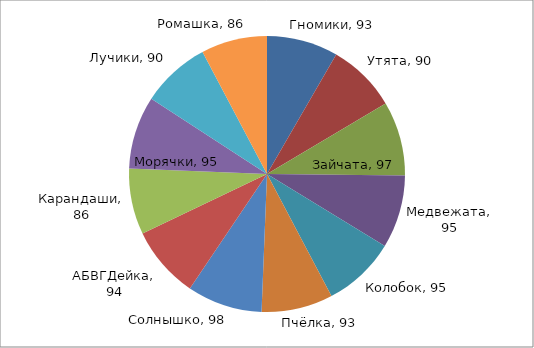
| Category | Series 0 |
|---|---|
| Гномики | 93 |
| Утята | 90 |
| Зайчата | 97 |
| Медвежата | 95 |
| Колобок | 95 |
| Пчёлка | 93 |
| Солнышко | 98 |
| АБВГДейка | 94 |
| Карандаши | 86 |
| Морячки | 95 |
| Лучики | 90 |
| Ромашка | 86 |